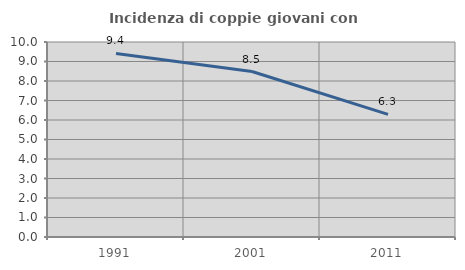
| Category | Incidenza di coppie giovani con figli |
|---|---|
| 1991.0 | 9.412 |
| 2001.0 | 8.485 |
| 2011.0 | 6.289 |